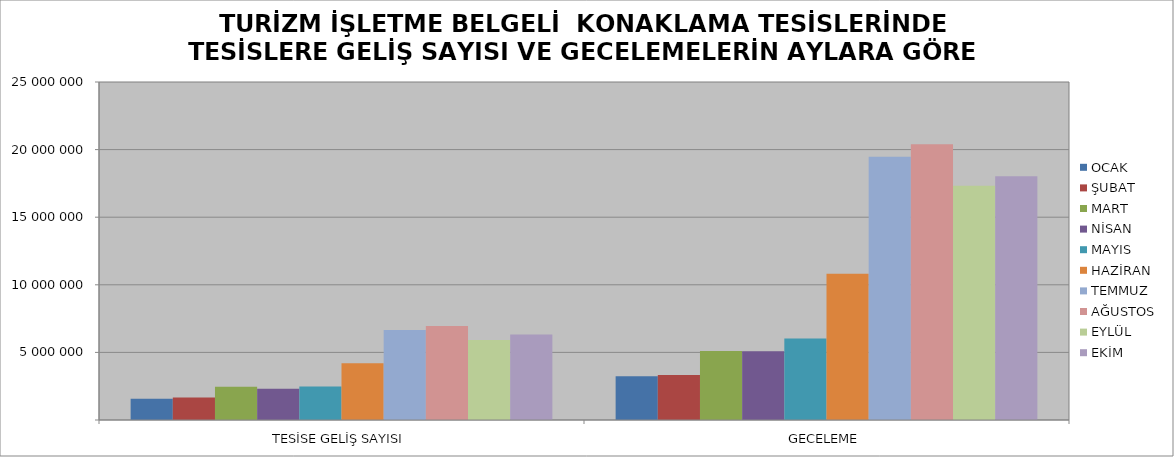
| Category | OCAK | ŞUBAT | MART | NİSAN | MAYIS | HAZİRAN | TEMMUZ | AĞUSTOS | EYLÜL | EKİM |
|---|---|---|---|---|---|---|---|---|---|---|
| TESİSE GELİŞ SAYISI | 1571594 | 1670164 | 2462715 | 2305703 | 2480312 | 4203299 | 6647723 | 6953153 | 5925169 | 6333100 |
| GECELEME | 3239980 | 3333484 | 5094921 | 5081446 | 6019981 | 10819754 | 19475865 | 20388962 | 17330893 | 18033301 |